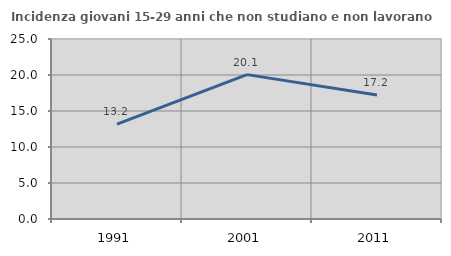
| Category | Incidenza giovani 15-29 anni che non studiano e non lavorano  |
|---|---|
| 1991.0 | 13.19 |
| 2001.0 | 20.055 |
| 2011.0 | 17.236 |